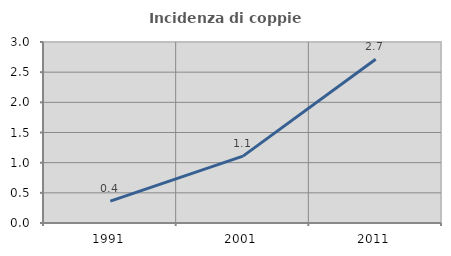
| Category | Incidenza di coppie miste |
|---|---|
| 1991.0 | 0.362 |
| 2001.0 | 1.108 |
| 2011.0 | 2.715 |